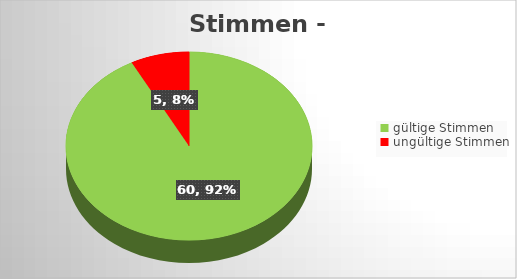
| Category | Series 0 |
|---|---|
| gültige Stimmen | 60 |
| ungültige Stimmen | 5 |